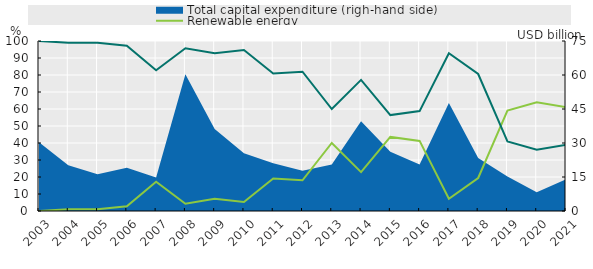
| Category | Renewable energy | Coal, oil and gas |
|---|---|---|
| 2003.0 | 0 | 100 |
| 2004.0 | 1 | 99 |
| 2005.0 | 1.096 | 98.904 |
| 2006.0 | 2.742 | 97.258 |
| 2007.0 | 17.177 | 82.823 |
| 2008.0 | 4.274 | 95.726 |
| 2009.0 | 7.153 | 92.847 |
| 2010.0 | 5.309 | 94.691 |
| 2011.0 | 19.135 | 80.865 |
| 2012.0 | 18.037 | 81.963 |
| 2013.0 | 40.015 | 59.985 |
| 2014.0 | 22.862 | 77.138 |
| 2015.0 | 43.588 | 56.412 |
| 2016.0 | 41.239 | 58.761 |
| 2017.0 | 7.206 | 92.794 |
| 2018.0 | 19.416 | 80.584 |
| 2019.0 | 59.096 | 40.904 |
| 2020.0 | 63.973 | 36.027 |
| 2021.0 | 61.044 | 38.956 |